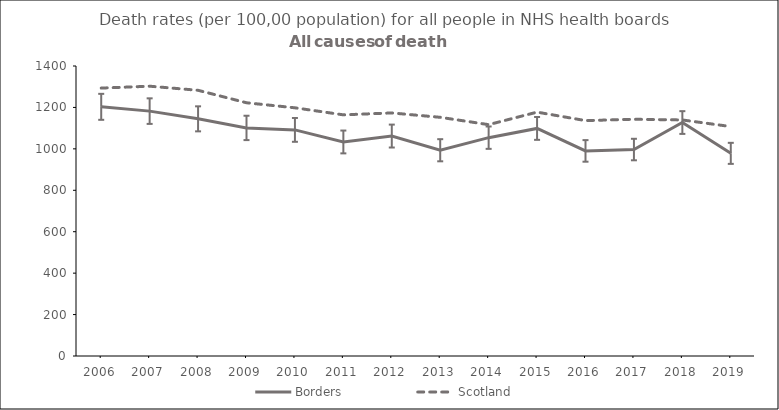
| Category | Borders | Scotland |
|---|---|---|
| 2006.0 | 1202.9 | 1293.4 |
| 2007.0 | 1182.2 | 1302.5 |
| 2008.0 | 1144.9 | 1282.7 |
| 2009.0 | 1101.1 | 1222.5 |
| 2010.0 | 1091.6 | 1198.2 |
| 2011.0 | 1033.3 | 1164.2 |
| 2012.0 | 1061.8 | 1173.4 |
| 2013.0 | 993.3 | 1152.3 |
| 2014.0 | 1054 | 1116.9 |
| 2015.0 | 1098.7 | 1177.3 |
| 2016.0 | 990.1 | 1136.4 |
| 2017.0 | 996.7 | 1142.9 |
| 2018.0 | 1127.1 | 1139.5 |
| 2019.0 | 978.3 | 1107.6 |